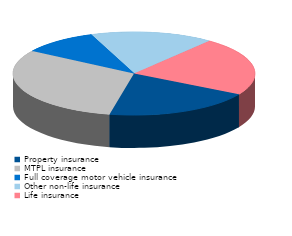
| Category | Series 0 |
|---|---|
| Property insurance | 19.9 |
| MTPL insurance | 30.9 |
| Full coverage motor vehicle insurance | 10.1 |
| Other non-life insurance | 16.4 |
| Life insurance | 22.7 |